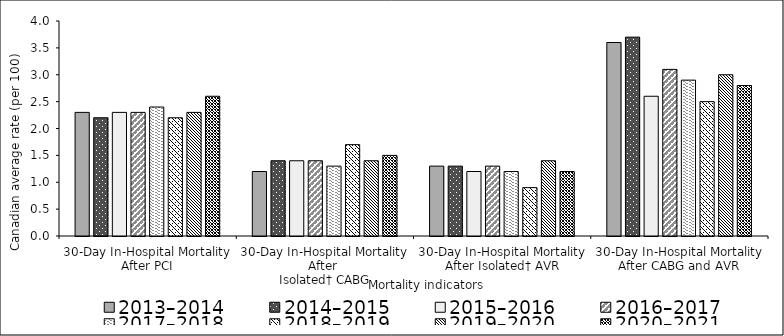
| Category | 2013–2014 | 2014–2015 | 2015–2016 | 2016–2017 | 2017–2018 | 2018–2019 | 2019–2020 | 2020–2021 |
|---|---|---|---|---|---|---|---|---|
| 30-Day In-Hospital Mortality After PCI | 2.3 | 2.2 | 2.3 | 2.3 | 2.4 | 2.2 | 2.3 | 2.6 |
| 30-Day In-Hospital Mortality After 
Isolated† CABG | 1.2 | 1.4 | 1.4 | 1.4 | 1.3 | 1.7 | 1.4 | 1.5 |
| 30-Day In-Hospital Mortality After Isolated† AVR | 1.3 | 1.3 | 1.2 | 1.3 | 1.2 | 0.9 | 1.4 | 1.2 |
| 30-Day In-Hospital Mortality After CABG and AVR | 3.6 | 3.7 | 2.6 | 3.1 | 2.9 | 2.5 | 3 | 2.8 |